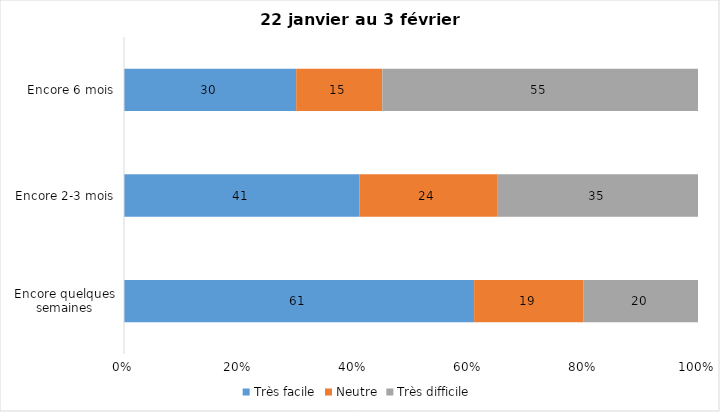
| Category | Très facile | Neutre | Très difficile |
|---|---|---|---|
| Encore quelques semaines | 61 | 19 | 20 |
| Encore 2-3 mois | 41 | 24 | 35 |
| Encore 6 mois | 30 | 15 | 55 |